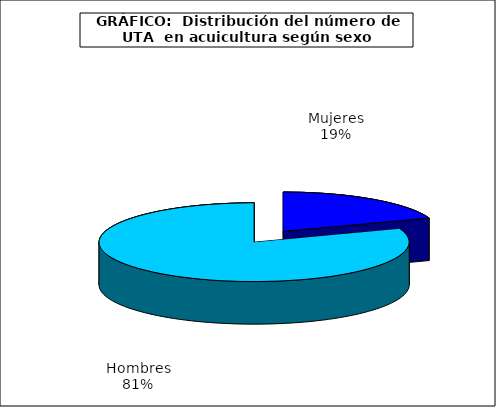
| Category | UTA | Series 1 |
|---|---|---|
| 0 | 1310.024 |  |
| 1 | 5419.749 |  |